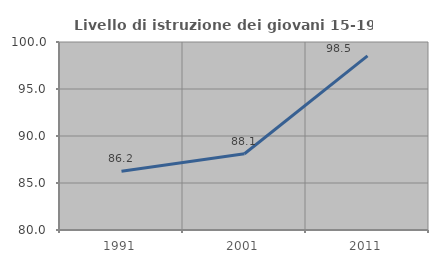
| Category | Livello di istruzione dei giovani 15-19 anni |
|---|---|
| 1991.0 | 86.247 |
| 2001.0 | 88.11 |
| 2011.0 | 98.525 |